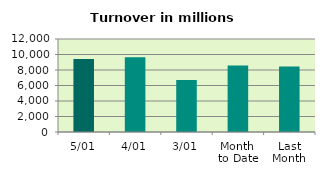
| Category | Series 0 |
|---|---|
| 5/01 | 9410.401 |
| 4/01 | 9651.562 |
| 3/01 | 6707.048 |
| Month 
to Date | 8589.67 |
| Last
Month | 8461.957 |